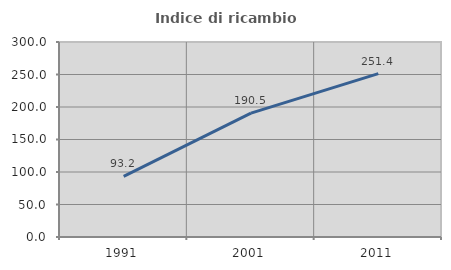
| Category | Indice di ricambio occupazionale  |
|---|---|
| 1991.0 | 93.197 |
| 2001.0 | 190.526 |
| 2011.0 | 251.389 |